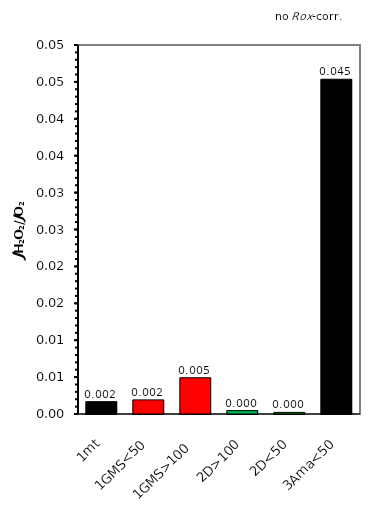
| Category | no ROX-corr. |
|---|---|
| 1mt | 0.002 |
| 1GMS<50 | 0.002 |
| 1GMS>100 | 0.005 |
| 2D>100 | 0 |
| 2D<50 | 0 |
| 3Ama<50 | 0.045 |